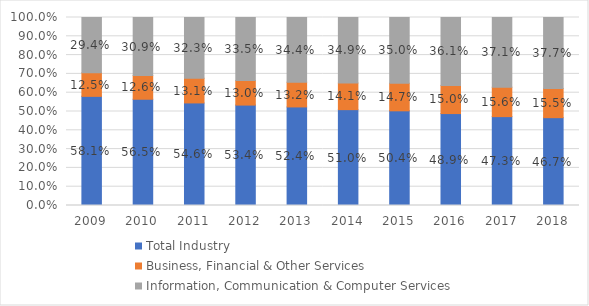
| Category | Total Industry | Business, Financial & Other Services | Information, Communication & Computer Services |
|---|---|---|---|
| 2009.0 | 0.581 | 0.125 | 0.294 |
| 2010.0 | 0.565 | 0.126 | 0.309 |
| 2011.0 | 0.546 | 0.131 | 0.323 |
| 2012.0 | 0.534 | 0.13 | 0.335 |
| 2013.0 | 0.524 | 0.132 | 0.344 |
| 2014.0 | 0.51 | 0.141 | 0.349 |
| 2015.0 | 0.504 | 0.147 | 0.35 |
| 2016.0 | 0.489 | 0.15 | 0.361 |
| 2017.0 | 0.473 | 0.156 | 0.371 |
| 2018.0 | 0.467 | 0.155 | 0.377 |